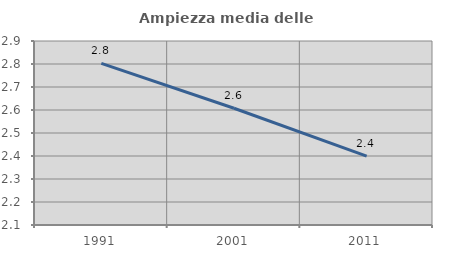
| Category | Ampiezza media delle famiglie |
|---|---|
| 1991.0 | 2.802 |
| 2001.0 | 2.608 |
| 2011.0 | 2.399 |